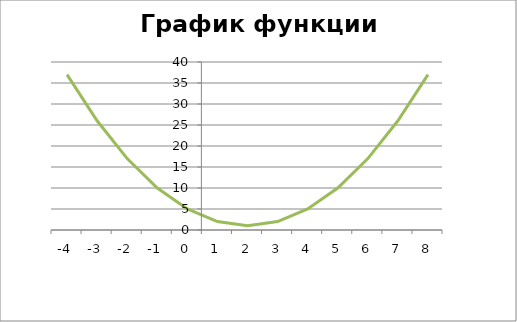
| Category | Series 0 |
|---|---|
| -4.0 | 37 |
| -3.0 | 26 |
| -2.0 | 17 |
| -1.0 | 10 |
| 0.0 | 5 |
| 1.0 | 2 |
| 2.0 | 1 |
| 3.0 | 2 |
| 4.0 | 5 |
| 5.0 | 10 |
| 6.0 | 17 |
| 7.0 | 26 |
| 8.0 | 37 |